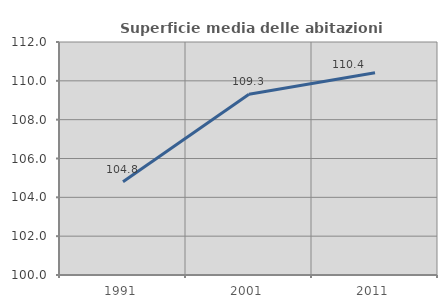
| Category | Superficie media delle abitazioni occupate |
|---|---|
| 1991.0 | 104.801 |
| 2001.0 | 109.312 |
| 2011.0 | 110.414 |